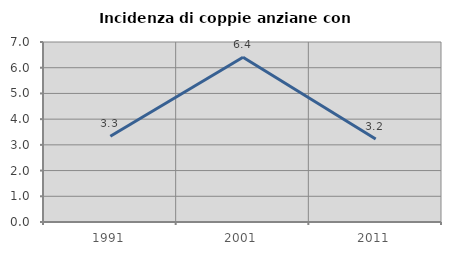
| Category | Incidenza di coppie anziane con figli |
|---|---|
| 1991.0 | 3.333 |
| 2001.0 | 6.41 |
| 2011.0 | 3.226 |